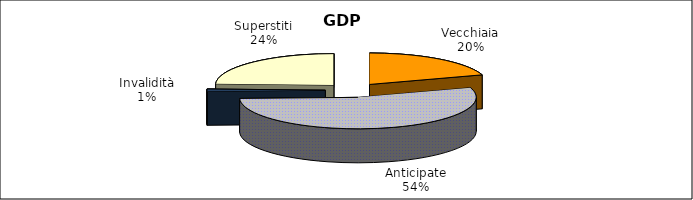
| Category | Series 0 |
|---|---|
| Vecchiaia | 3791 |
| Anticipate | 10287 |
| Invalidità | 225 |
| Superstiti | 4602 |